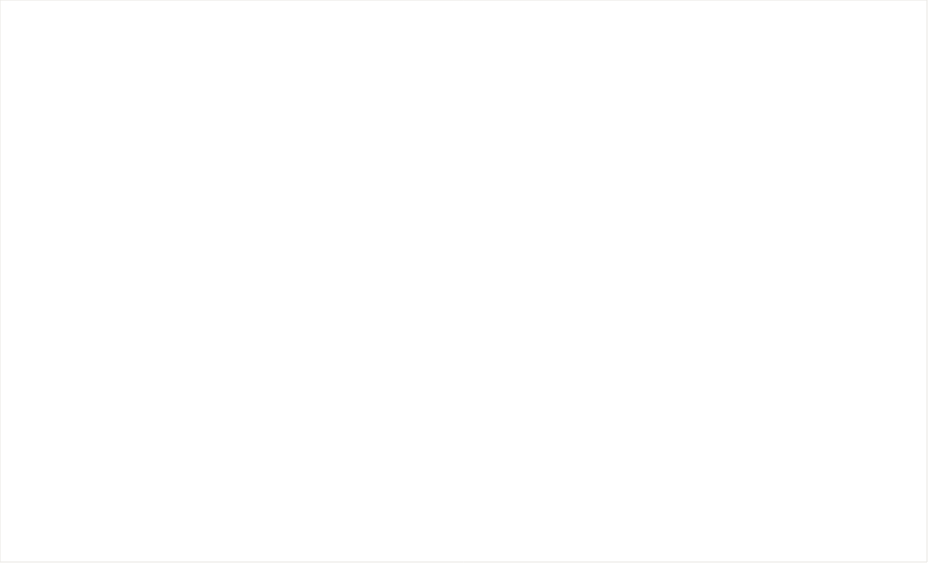
| Category | Total Payment  |
|---|---|
| 2018/11/16 | 525.75 |
| 2018/12/16 | 525.75 |
| 2019/01/16 | 525.75 |
| 2019/02/16 | 525.75 |
| 2019/03/16 | 525.75 |
| 2019/04/16 | 525.75 |
| 2019/05/16 | 525.75 |
| 2019/06/16 | 525.75 |
| 2019/07/16 | 525.75 |
| 2019/08/16 | 356.687 |